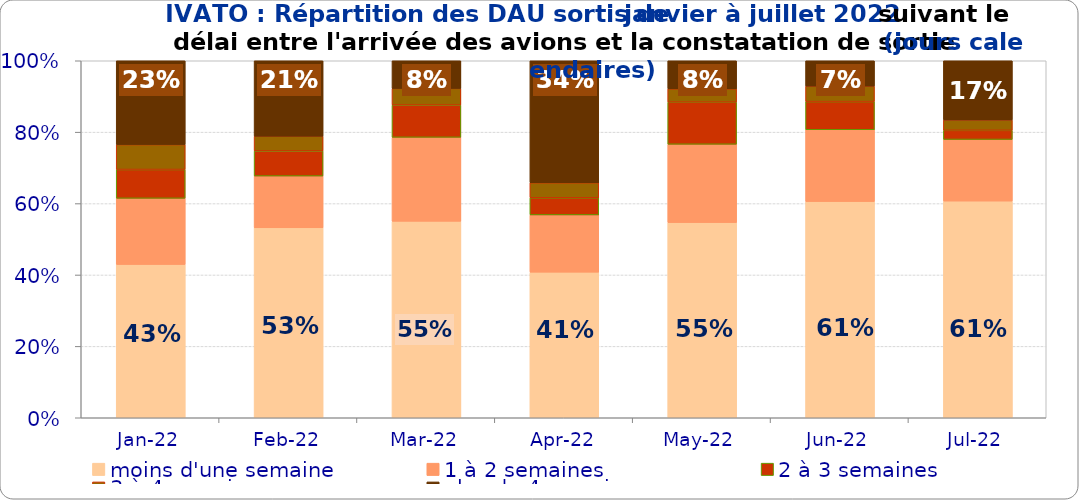
| Category | moins d'une semaine | 1 à 2 semaines | 2 à 3 semaines | 3 à 4 semaines | plus de 4 semaines |
|---|---|---|---|---|---|
| 2022-01-01 | 0.429 | 0.185 | 0.081 | 0.07 | 0.235 |
| 2022-02-01 | 0.532 | 0.145 | 0.07 | 0.041 | 0.211 |
| 2022-03-01 | 0.55 | 0.235 | 0.09 | 0.047 | 0.078 |
| 2022-04-01 | 0.408 | 0.16 | 0.048 | 0.042 | 0.342 |
| 2022-05-01 | 0.547 | 0.219 | 0.118 | 0.037 | 0.079 |
| 2022-06-01 | 0.606 | 0.201 | 0.079 | 0.043 | 0.071 |
| 2022-07-01 | 0.607 | 0.173 | 0.026 | 0.029 | 0.166 |